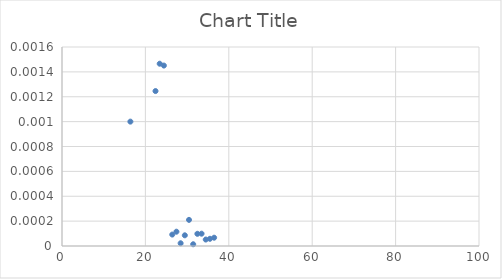
| Category | Series 0 |
|---|---|
| 16.4 | 0.001 |
| 22.4245 | 0.001 |
| 23.4286 | 0.001 |
| 24.4327 | 0.001 |
| 26.4408 | 0 |
| 27.4449 | 0 |
| 28.449 | 0 |
| 29.4531 | 0 |
| 30.4571 | 0 |
| 31.4612 | 0 |
| 32.4653 | 0 |
| 33.4694 | 0 |
| 34.4735 | 0 |
| 35.4776 | 0 |
| 36.4816 | 0 |